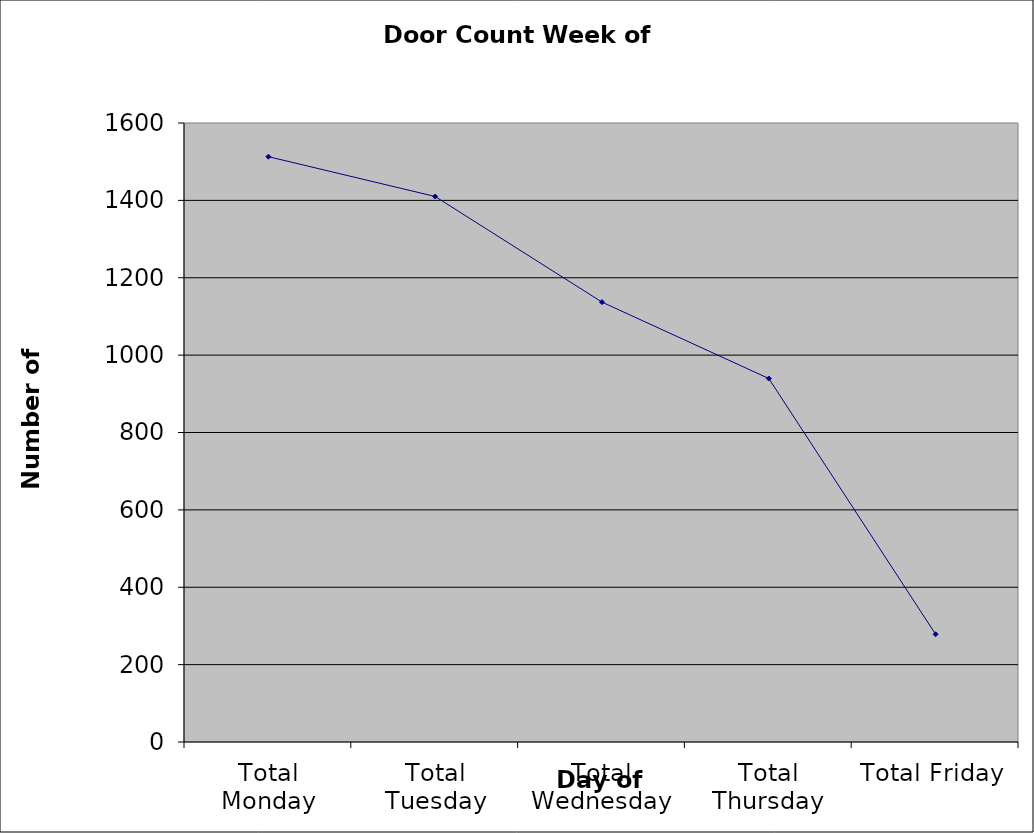
| Category | Series 0 |
|---|---|
| Total Monday | 1513 |
| Total Tuesday | 1410 |
| Total Wednesday | 1137 |
| Total Thursday | 939.5 |
| Total Friday | 278.5 |